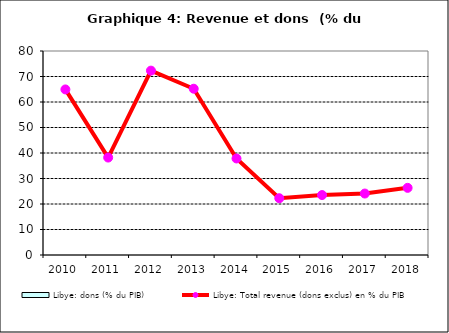
| Category | Libye: dons (% du PIB) |
|---|---|
| 2010.0 | 0 |
| 2011.0 | 0 |
| 2012.0 | 0 |
| 2013.0 | 0 |
| 2014.0 | 0 |
| 2015.0 | 0 |
| 2016.0 | 0 |
| 2017.0 | 0 |
| 2018.0 | 0 |